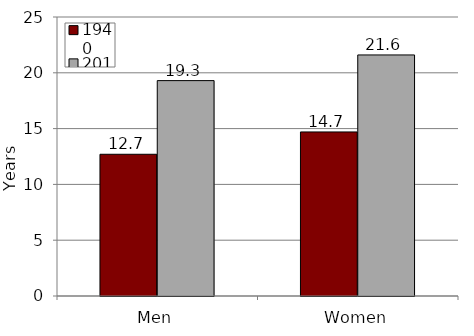
| Category | 1940 | 2015 |
|---|---|---|
| Men | 12.7 | 19.3 |
| Women | 14.7 | 21.6 |